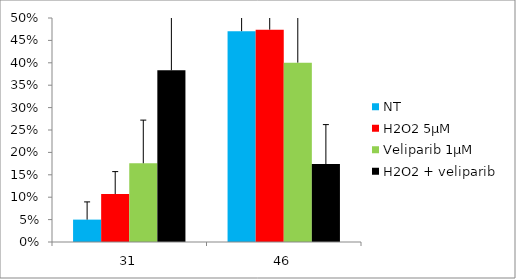
| Category | NT | H2O2 5µM | Veliparib 1µM | H2O2 + veliparib |
|---|---|---|---|---|
| 31.0 | 0.05 | 0.107 | 0.176 | 0.383 |
| 46.0 | 0.471 | 0.474 | 0.4 | 0.174 |